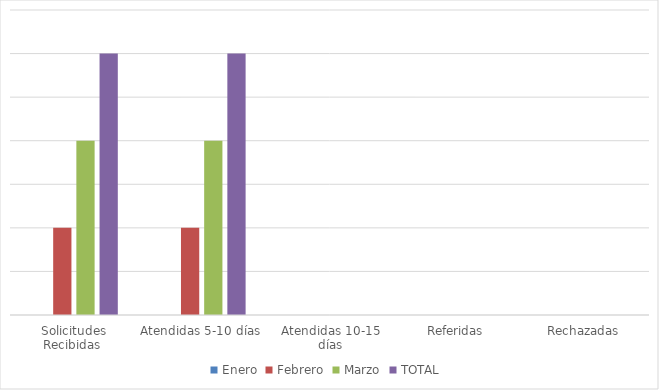
| Category | Enero | Febrero | Marzo | TOTAL  |
|---|---|---|---|---|
| Solicitudes Recibidas  | 0 | 1 | 2 | 3 |
| Atendidas 5-10 días | 0 | 1 | 2 | 3 |
| Atendidas 10-15 días | 0 | 0 | 0 | 0 |
| Referidas | 0 | 0 | 0 | 0 |
| Rechazadas | 0 | 0 | 0 | 0 |